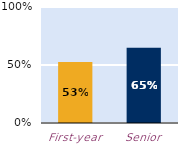
| Category | At least some |
|---|---|
| First-year | 0.527 |
| Senior | 0.65 |